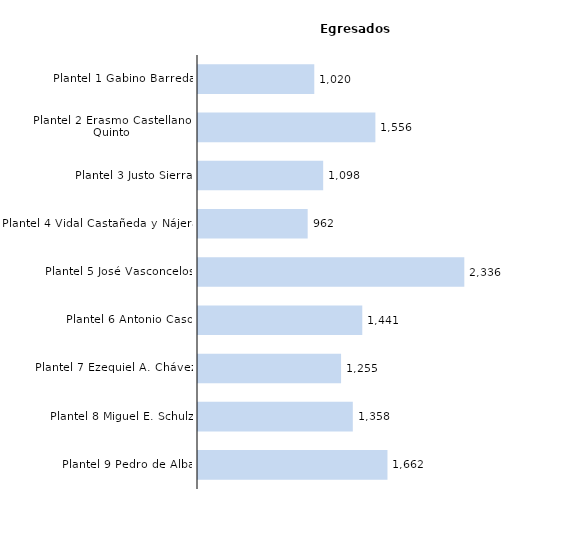
| Category | Series 0 |
|---|---|
| Plantel 9 Pedro de Alba | 1662 |
| Plantel 8 Miguel E. Schulz | 1358 |
| Plantel 7 Ezequiel A. Chávez | 1255 |
| Plantel 6 Antonio Caso | 1441 |
| Plantel 5 José Vasconcelos | 2336 |
| Plantel 4 Vidal Castañeda y Nájera | 962 |
| Plantel 3 Justo Sierra | 1098 |
| Plantel 2 Erasmo Castellanos Quinto | 1556 |
| Plantel 1 Gabino Barreda | 1020 |